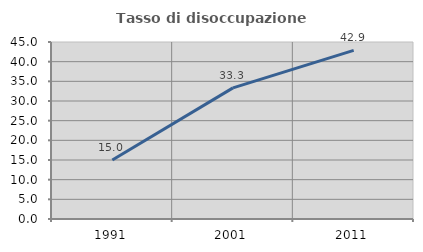
| Category | Tasso di disoccupazione giovanile  |
|---|---|
| 1991.0 | 15 |
| 2001.0 | 33.333 |
| 2011.0 | 42.857 |